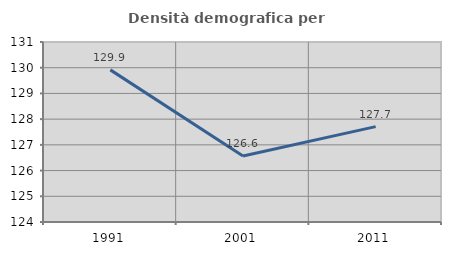
| Category | Densità demografica |
|---|---|
| 1991.0 | 129.916 |
| 2001.0 | 126.565 |
| 2011.0 | 127.708 |